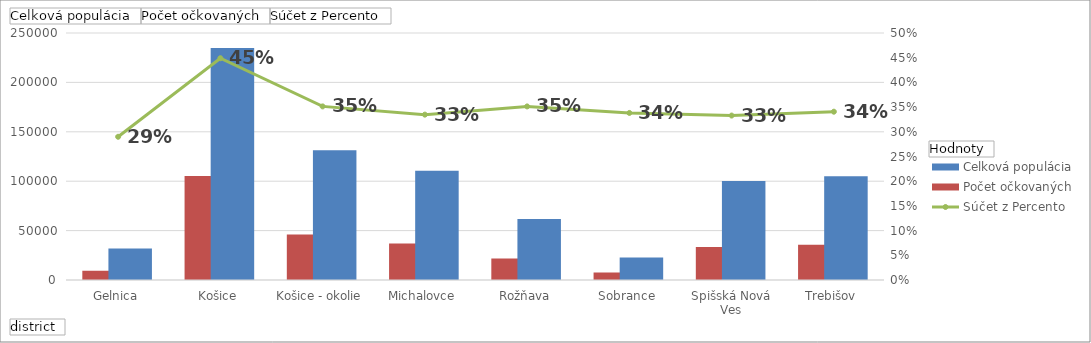
| Category | Počet očkovaných | Celková populácia |
|---|---|---|
| Gelnica | 9239 | 31865 |
| Košice | 105375 | 234707 |
| Košice - okolie | 46134 | 131280 |
| Michalovce | 36978 | 110460 |
| Rožňava | 21709 | 61782 |
| Sobrance | 7688 | 22734 |
| Spišská Nová Ves | 33327 | 100120 |
| Trebišov | 35755 | 104951 |